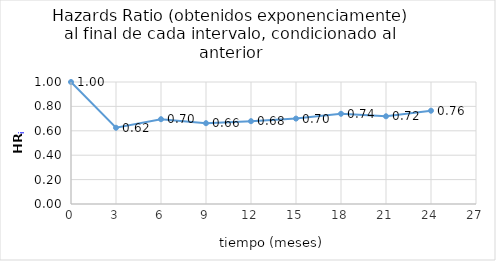
| Category | HRi |
|---|---|
| 0.0 | 1 |
| 3.0 | 0.625 |
| 6.0 | 0.695 |
| 9.0 | 0.662 |
| 12.0 | 0.679 |
| 15.0 | 0.7 |
| 18.0 | 0.739 |
| 21.0 | 0.719 |
| 24.0 | 0.765 |